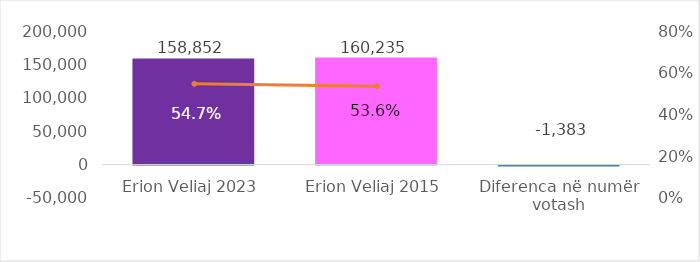
| Category | Vota Kandidati |
|---|---|
| Erion Veliaj 2023 | 158852 |
| Erion Veliaj 2015 | 160235 |
| Diferenca në numër votash | -1383 |